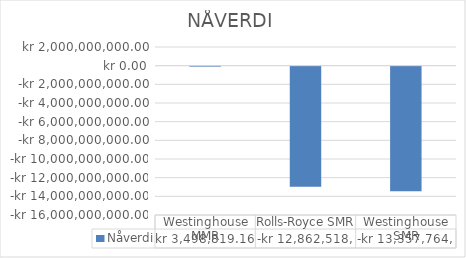
| Category | Nåverdi |
|---|---|
| Westinghouse MMR | 3498819.159 |
| Rolls-Royce SMR | -12862518180.478 |
|  Westinghouse SMR  | -13357764710.295 |